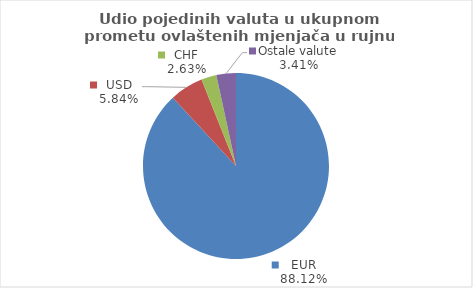
| Category | Series 0 |
|---|---|
| EUR | 88.125 |
| USD | 5.838 |
| CHF | 2.632 |
| Ostale valute | 3.405 |